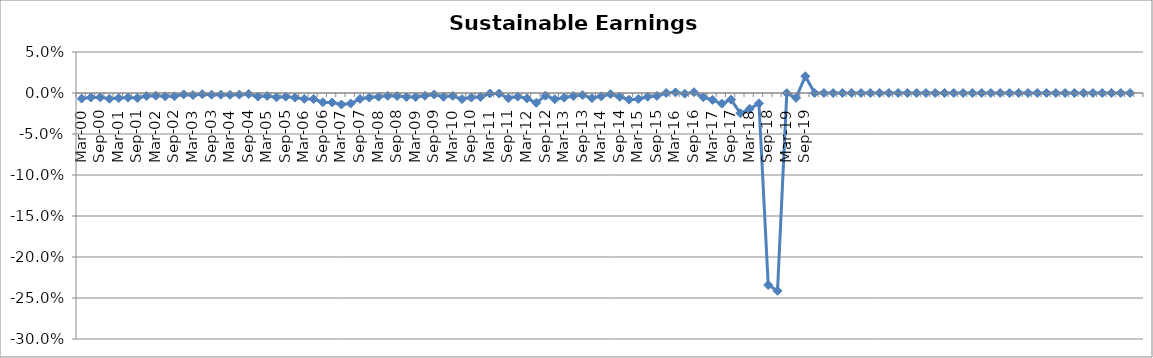
| Category | Sustainable Earnings Indicator |
|---|---|
| Mar-00 | -0.007 |
| Jun-00 | -0.005 |
| Sep-00 | -0.005 |
| Dec-00 | -0.007 |
| Mar-01 | -0.006 |
| Jun-01 | -0.006 |
| Sep-01 | -0.006 |
| Dec-01 | -0.004 |
| Mar-02 | -0.003 |
| Jun-02 | -0.004 |
| Sep-02 | -0.004 |
| Dec-02 | -0.002 |
| Mar-03 | -0.002 |
| Jun-03 | -0.001 |
| Sep-03 | -0.002 |
| Dec-03 | -0.002 |
| Mar-04 | -0.002 |
| Jun-04 | -0.002 |
| Sep-04 | -0.001 |
| Dec-04 | -0.004 |
| Mar-05 | -0.004 |
| Jun-05 | -0.005 |
| Sep-05 | -0.004 |
| Dec-05 | -0.006 |
| Mar-06 | -0.007 |
| Jun-06 | -0.007 |
| Sep-06 | -0.011 |
| Dec-06 | -0.012 |
| Mar-07 | -0.014 |
| Jun-07 | -0.013 |
| Sep-07 | -0.007 |
| Dec-07 | -0.006 |
| Mar-08 | -0.005 |
| Jun-08 | -0.003 |
| Sep-08 | -0.004 |
| Dec-08 | -0.005 |
| Mar-09 | -0.005 |
| Jun-09 | -0.003 |
| Sep-09 | -0.002 |
| Dec-09 | -0.005 |
| Mar-10 | -0.004 |
| Jun-10 | -0.007 |
| Sep-10 | -0.006 |
| Dec-10 | -0.005 |
| Mar-11 | -0.001 |
| Jun-11 | -0.001 |
| Sep-11 | -0.006 |
| Dec-11 | -0.004 |
| Mar-12 | -0.007 |
| Jun-12 | -0.012 |
| Sep-12 | -0.003 |
| Dec-12 | -0.008 |
| Mar-13 | -0.006 |
| Jun-13 | -0.004 |
| Sep-13 | -0.002 |
| Dec-13 | -0.006 |
| Mar-14 | -0.004 |
| Jun-14 | -0.001 |
| Sep-14 | -0.005 |
| Dec-14 | -0.008 |
| Mar-15 | -0.007 |
| Jun-15 | -0.005 |
| Sep-15 | -0.004 |
| Dec-15 | 0 |
| Mar-16 | 0.001 |
| Jun-16 | -0.001 |
| Sep-16 | 0.001 |
| Dec-16 | -0.005 |
| Mar-17 | -0.008 |
| Jun-17 | -0.013 |
| Sep-17 | -0.008 |
| Dec-17 | -0.025 |
| Mar-18 | -0.019 |
| Jun-18 | -0.013 |
| Sep-18 | -0.234 |
| Dec-18 | -0.241 |
| Mar-19 | 0 |
| Jun-19 | -0.006 |
| Sep-19 | 0.02 |